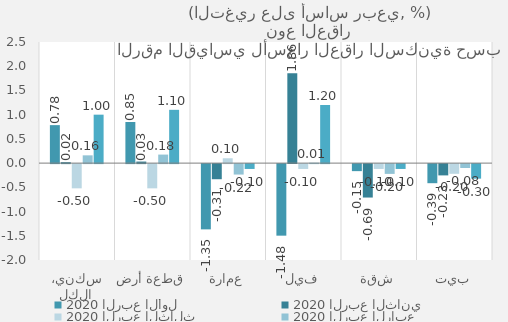
| Category | 2020 | 2021 |
|---|---|---|
| سكني، الكل | 0.16 | 1 |
| قطعة أرض | 0.176 | 1.1 |
| عمارة | -0.216 | -0.1 |
| فيلا | 0.009 | 1.2 |
| شقة | -0.202 | -0.1 |
| بيت | -0.08 | -0.3 |